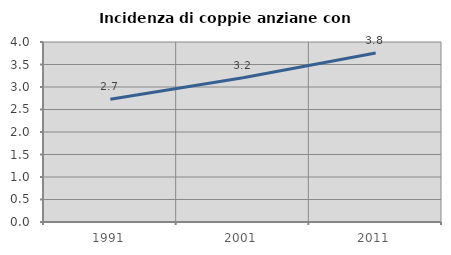
| Category | Incidenza di coppie anziane con figli |
|---|---|
| 1991.0 | 2.73 |
| 2001.0 | 3.204 |
| 2011.0 | 3.756 |